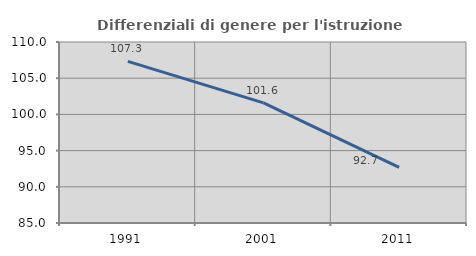
| Category | Differenziali di genere per l'istruzione superiore |
|---|---|
| 1991.0 | 107.328 |
| 2001.0 | 101.589 |
| 2011.0 | 92.672 |